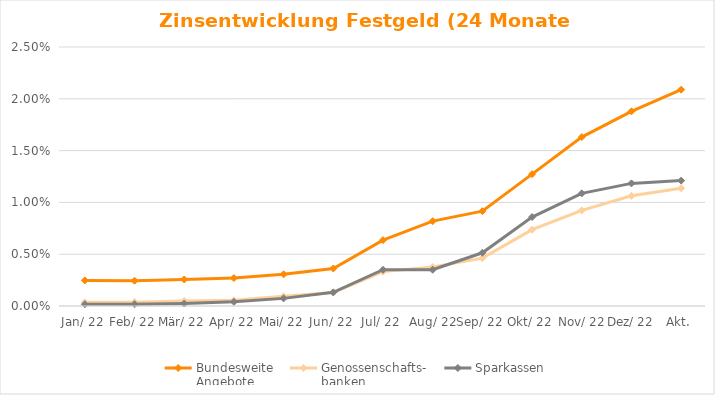
| Category | Bundesweite
Angebote | Genossenschafts-
banken | Sparkassen |
|---|---|---|---|
| Jan. 22 | 0.002 | 0 | 0 |
| Feb. 22 | 0.002 | 0 | 0 |
| Mrz. 22 | 0.003 | 0 | 0 |
| Apr. 22 | 0.003 | 0.001 | 0 |
| Mai. 22 | 0.003 | 0.001 | 0.001 |
| Jun. 22 | 0.004 | 0.001 | 0.001 |
| Jul. 22 | 0.006 | 0.003 | 0.003 |
| Aug. 22 | 0.008 | 0.004 | 0.004 |
| Sep. 22 | 0.009 | 0.005 | 0.005 |
| Okt. 22 | 0.013 | 0.007 | 0.009 |
| Nov. 22 | 0.016 | 0.009 | 0.011 |
| Dez. 22 | 0.019 | 0.011 | 0.012 |
| Akt. | 0.021 | 0.011 | 0.012 |